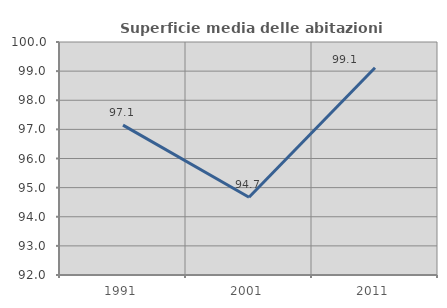
| Category | Superficie media delle abitazioni occupate |
|---|---|
| 1991.0 | 97.146 |
| 2001.0 | 94.67 |
| 2011.0 | 99.117 |